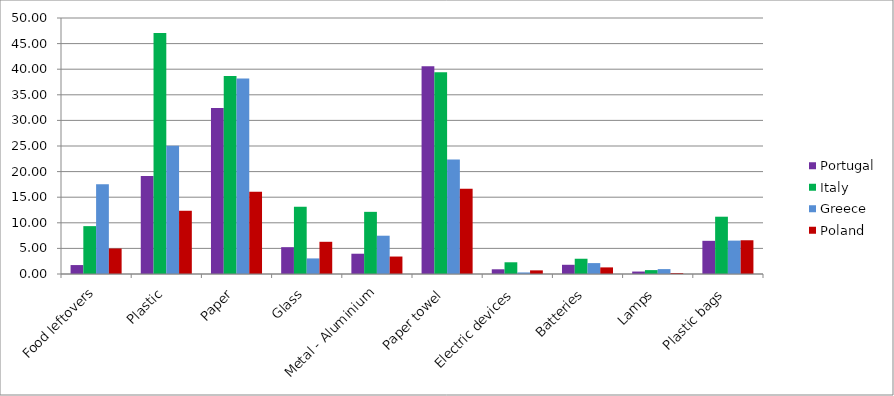
| Category | Portugal | Italy | Greece | Poland |
|---|---|---|---|---|
| Food leftovers | 1.745 | 9.35 | 17.513 | 4.98 |
| Plastic | 19.16 | 47.05 | 25.043 | 12.35 |
| Paper | 32.4 | 38.67 | 38.174 | 16.06 |
| Glass | 5.24 | 13.14 | 3.043 | 6.29 |
| Metal - Aluminium | 3.96 | 12.14 | 7.478 | 3.41 |
| Paper towel | 40.56 | 39.38 | 22.348 | 16.65 |
| Electric devices | 0.92 | 2.29 | 0.304 | 0.71 |
| Batteries | 1.8 | 2.98 | 2.13 | 1.29 |
| Lamps | 0.48 | 0.76 | 0.957 | 0.18 |
| Plastic bags | 6.48 | 11.19 | 6.522 | 6.59 |